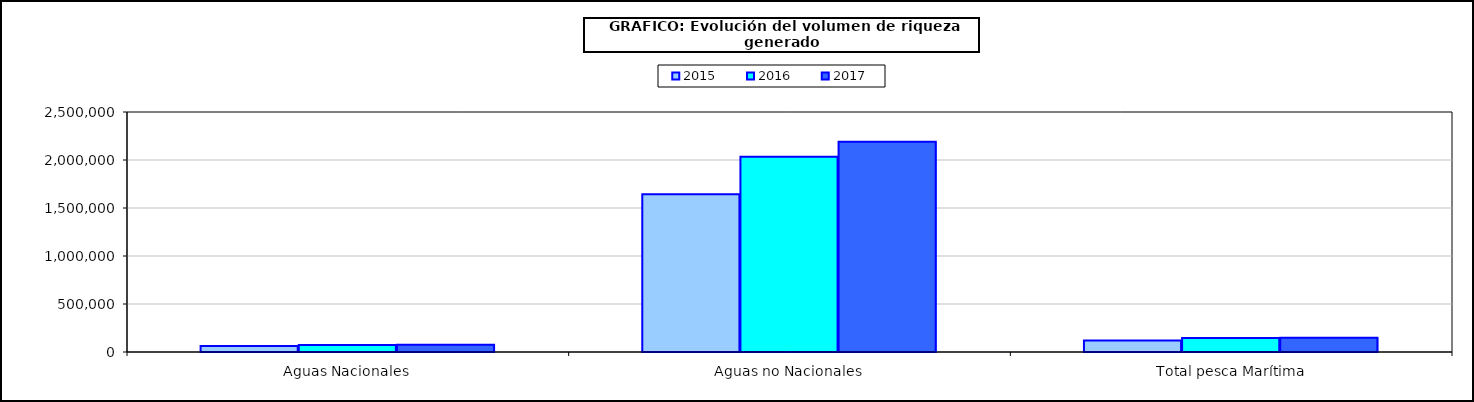
| Category | 2015 | 2016 | 2017 |
|---|---|---|---|
| 0 | 61721.457 | 73392.8 | 74797.768 |
| 1 | 1642691.799 | 2034075.664 | 2190184.753 |
| 2 | 119982.334 | 145649.539 | 148783.272 |